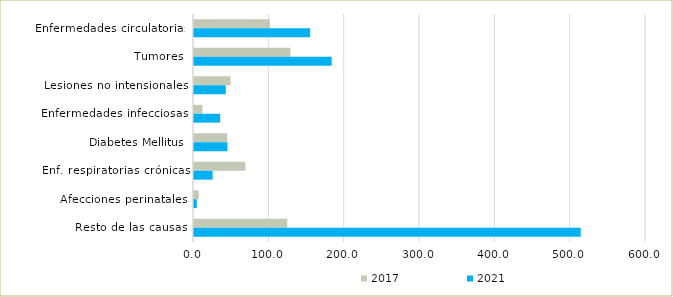
| Category | 2017 | 2021 |
|---|---|---|
| Enfermedades circulatorias | 100.797 | 154.19 |
| Tumores | 128.074 | 182.773 |
| Lesiones no intensionales | 48.596 | 42.193 |
| Enfermedades infecciosas | 11.13 | 34.805 |
| Diabetes Mellitus | 44.05 | 44.332 |
| Enf. respiratorias crónicas | 68.191 | 24.694 |
| Afecciones perinatales | 6.27 | 3.694 |
| Resto de las causas | 123.841 | 513.319 |